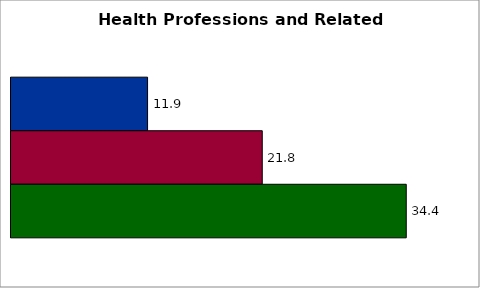
| Category | 50 states and D.C. | SREB states | State |
|---|---|---|---|
| 0 | 11.876 | 21.848 | 34.37 |